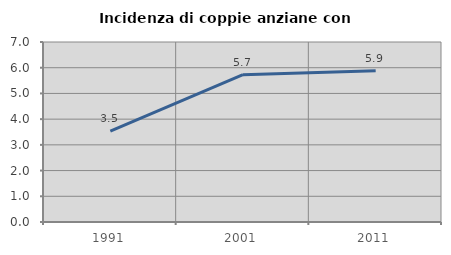
| Category | Incidenza di coppie anziane con figli |
|---|---|
| 1991.0 | 3.534 |
| 2001.0 | 5.729 |
| 2011.0 | 5.882 |